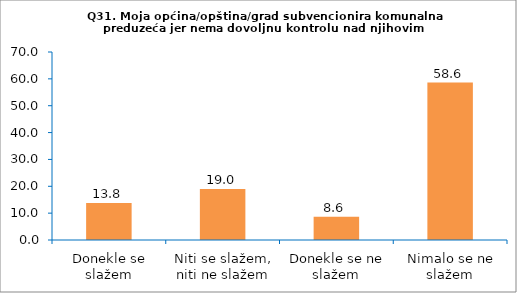
| Category | Series 0 |
|---|---|
| Donekle se slažem | 13.793 |
| Niti se slažem, niti ne slažem | 18.966 |
| Donekle se ne slažem | 8.621 |
| Nimalo se ne slažem | 58.621 |